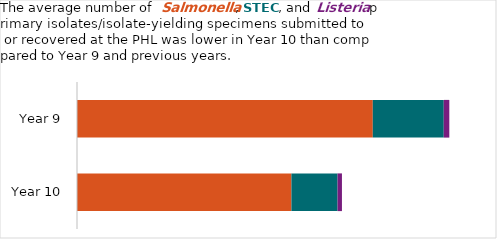
| Category | Salmonella | STEC | Listeria |
|---|---|---|---|
| Year 9 | 1010 | 242.333 | 19 |
| Year 10 | 732.1 | 157.6 | 15 |